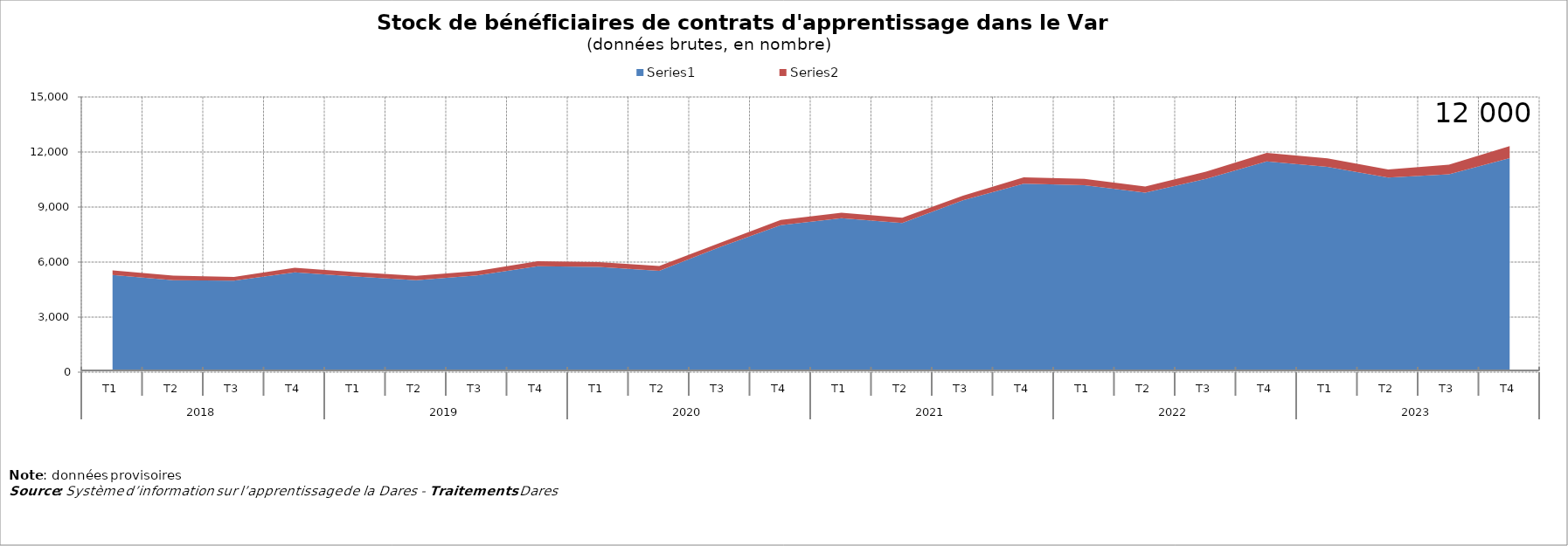
| Category | Series 0 | Series 1 |
|---|---|---|
| 0 | 5292 | 257 |
| 1 | 5013 | 249 |
| 2 | 4983 | 203 |
| 3 | 5438 | 250 |
| 4 | 5214 | 242 |
| 5 | 5015 | 240 |
| 6 | 5279 | 229 |
| 7 | 5778 | 267 |
| 8 | 5734 | 263 |
| 9 | 5522 | 259 |
| 10 | 6827 | 226 |
| 11 | 8015 | 285 |
| 12 | 8393 | 294 |
| 13 | 8130 | 287 |
| 14 | 9372 | 252 |
| 15 | 10278 | 343 |
| 16 | 10195 | 344 |
| 17 | 9784 | 337 |
| 18 | 10538 | 387 |
| 19 | 11485 | 462 |
| 20 | 11190 | 460 |
| 21 | 10602 | 447 |
| 22 | 10785 | 519 |
| 23 | 11666 | 661 |